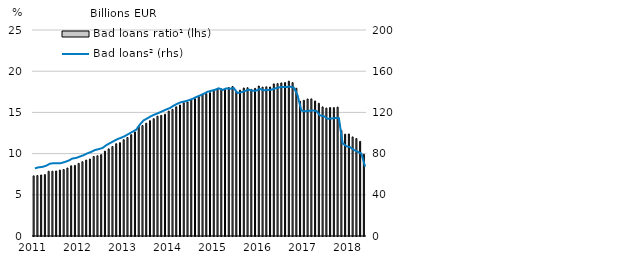
| Category | Bad loans ratio¹ (lhs) |
|---|---|
| 2011.0 | 7.298 |
| nan | 7.337 |
| nan | 7.406 |
| nan | 7.454 |
| nan | 7.855 |
| nan | 7.863 |
| nan | 7.89 |
| nan | 8.002 |
| nan | 8.074 |
| nan | 8.253 |
| nan | 8.517 |
| nan | 8.571 |
| 2012.0 | 8.813 |
| nan | 9.02 |
| nan | 9.217 |
| nan | 9.34 |
| nan | 9.652 |
| nan | 9.742 |
| nan | 9.873 |
| nan | 10.3 |
| nan | 10.575 |
| nan | 10.86 |
| nan | 11.198 |
| nan | 11.323 |
| 2013.0 | 11.691 |
| nan | 11.958 |
| nan | 12.299 |
| nan | 12.623 |
| nan | 13.306 |
| nan | 13.407 |
| nan | 13.689 |
| nan | 13.997 |
| nan | 14.243 |
| nan | 14.543 |
| nan | 14.643 |
| nan | 14.78 |
| 2014.0 | 15.162 |
| nan | 15.369 |
| nan | 15.679 |
| nan | 15.897 |
| nan | 16.185 |
| nan | 16.262 |
| nan | 16.523 |
| nan | 16.666 |
| nan | 16.908 |
| nan | 17.206 |
| nan | 17.273 |
| nan | 17.393 |
| 2015.0 | 17.71 |
| nan | 17.859 |
| nan | 17.856 |
| nan | 17.823 |
| nan | 18.017 |
| nan | 18.141 |
| nan | 17.544 |
| nan | 17.697 |
| nan | 17.963 |
| nan | 17.993 |
| nan | 17.802 |
| nan | 17.916 |
| 2016.0 | 18.199 |
| nan | 18.068 |
| nan | 18.106 |
| nan | 18.079 |
| nan | 18.461 |
| nan | 18.498 |
| nan | 18.577 |
| nan | 18.618 |
| nan | 18.794 |
| nan | 18.613 |
| nan | 17.929 |
| nan | 16.358 |
| 2017.0 | 16.472 |
| nan | 16.627 |
| nan | 16.639 |
| nan | 16.386 |
| nan | 16.107 |
| nan | 15.668 |
| nan | 15.527 |
| nan | 15.589 |
| nan | 15.579 |
| nan | 15.643 |
| nan | 12.81 |
| nan | 12.355 |
| 2018.0 | 12.379 |
| nan | 12.025 |
| nan | 11.827 |
| nan | 11.485 |
| nan | 9.915 |